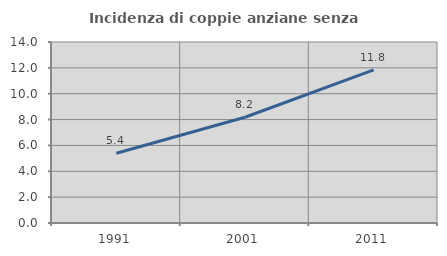
| Category | Incidenza di coppie anziane senza figli  |
|---|---|
| 1991.0 | 5.394 |
| 2001.0 | 8.18 |
| 2011.0 | 11.843 |